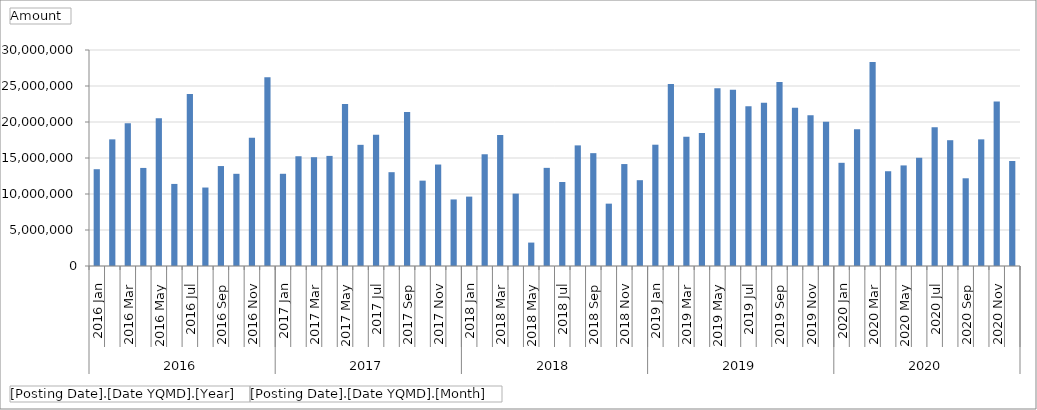
| Category | Total |
|---|---|
| 0 | 13443029.07 |
| 1 | 17588816.54 |
| 2 | 19819013.35 |
| 3 | 13620679.7 |
| 4 | 20504406.94 |
| 5 | 11399058.16 |
| 6 | 23876479.9 |
| 7 | 10898451.57 |
| 8 | 13881618.5 |
| 9 | 12804640.64 |
| 10 | 17800145.43 |
| 11 | 26199358.42 |
| 12 | 12807781.12 |
| 13 | 15245348.76 |
| 14 | 15110800.66 |
| 15 | 15291110.87 |
| 16 | 22489930.58 |
| 17 | 16829078.05 |
| 18 | 18212131.5 |
| 19 | 13029391.43 |
| 20 | 21371936.86 |
| 21 | 11854643.6 |
| 22 | 14092302.71 |
| 23 | 9244113.34 |
| 24 | 9636956.28 |
| 25 | 15518928.05 |
| 26 | 18210204.77 |
| 27 | 10053284.19 |
| 28 | 3252561.08 |
| 29 | 13631015.01 |
| 30 | 11670415.06 |
| 31 | 16751704.19 |
| 32 | 15672900.89 |
| 33 | 8660330.72 |
| 34 | 14158609.06 |
| 35 | 11918568.93 |
| 36 | 16846466.42 |
| 37 | 25264093.81 |
| 38 | 17966789.32 |
| 39 | 18456796.61 |
| 40 | 24677111.21 |
| 41 | 24475197.01 |
| 42 | 22190001.4 |
| 43 | 22680629.39 |
| 44 | 25542949.49 |
| 45 | 21991739.82 |
| 46 | 20953943.55 |
| 47 | 20033616.3 |
| 48 | 14332672.74 |
| 49 | 18994602.57 |
| 50 | 28336604.24 |
| 51 | 13162148.48 |
| 52 | 13968995.89 |
| 53 | 15031968.98 |
| 54 | 19254765.28 |
| 55 | 17471227.83 |
| 56 | 12182927.31 |
| 57 | 17589601.44 |
| 58 | 22862468.9 |
| 59 | 14582338.74 |